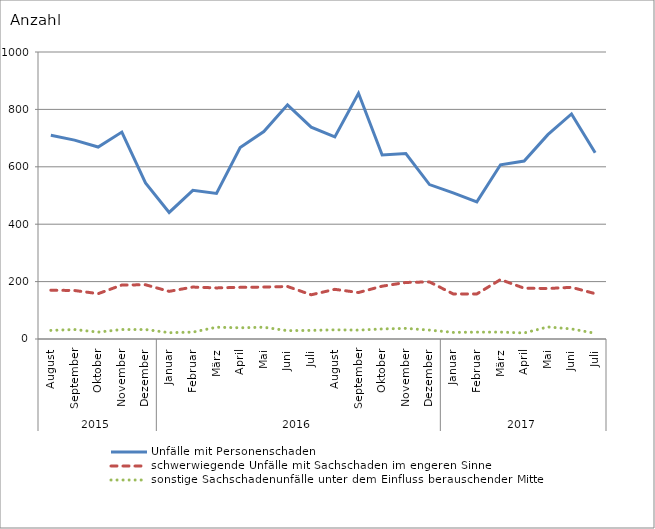
| Category | Unfälle mit Personenschaden | schwerwiegende Unfälle mit Sachschaden im engeren Sinne | sonstige Sachschadenunfälle unter dem Einfluss berauschender Mittel |
|---|---|---|---|
| 0 | 710 | 170 | 30 |
| 1 | 693 | 169 | 33 |
| 2 | 669 | 158 | 24 |
| 3 | 721 | 188 | 33 |
| 4 | 544 | 189 | 33 |
| 5 | 441 | 166 | 22 |
| 6 | 518 | 181 | 24 |
| 7 | 507 | 178 | 41 |
| 8 | 667 | 180 | 39 |
| 9 | 723 | 181 | 41 |
| 10 | 816 | 183 | 29 |
| 11 | 738 | 154 | 30 |
| 12 | 704 | 173 | 32 |
| 13 | 856 | 162 | 31 |
| 14 | 641 | 184 | 35 |
| 15 | 646 | 197 | 37 |
| 16 | 538 | 199 | 31 |
| 17 | 509 | 157 | 23 |
| 18 | 478 | 157 | 24 |
| 19 | 607 | 207 | 24 |
| 20 | 620 | 177 | 21 |
| 21 | 712 | 176 | 42 |
| 22 | 784 | 180 | 35 |
| 23 | 649 | 158 | 20 |